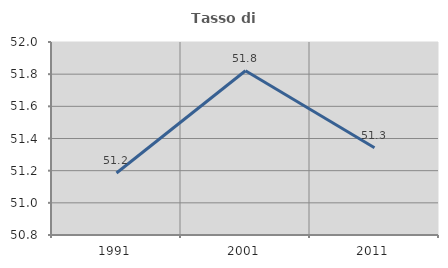
| Category | Tasso di occupazione   |
|---|---|
| 1991.0 | 51.185 |
| 2001.0 | 51.821 |
| 2011.0 | 51.343 |